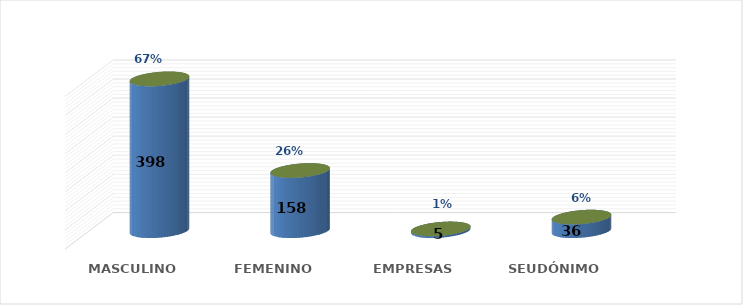
| Category | SOLICITUD POR GÉNERO | Series 1 |
|---|---|---|
| MASCULINO | 398 | 0.667 |
| FEMENINO | 158 | 0.265 |
| EMPRESAS | 5 | 0.008 |
| SEUDÓNIMO | 36 | 0.06 |